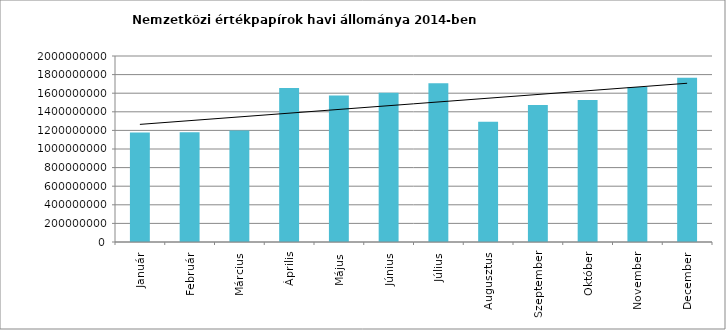
| Category | Series 0 |
|---|---|
| Január | 1177439934.9 |
| Február | 1179999253.32 |
| Március | 1199047139.34 |
| Április | 1656027055.36 |
| Május | 1576500566.07 |
| Június | 1605480021.16 |
| Július | 1707587250.81 |
| Augusztus | 1293290758.18 |
| Szeptember | 1473957318.79 |
| Október | 1526081844.7 |
| November | 1667450723.46 |
| December | 1766297478.38 |